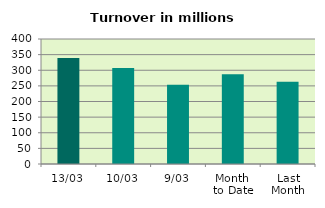
| Category | Series 0 |
|---|---|
| 13/03 | 339.511 |
| 10/03 | 307.03 |
| 9/03 | 253.871 |
| Month 
to Date | 287.143 |
| Last
Month | 263.32 |